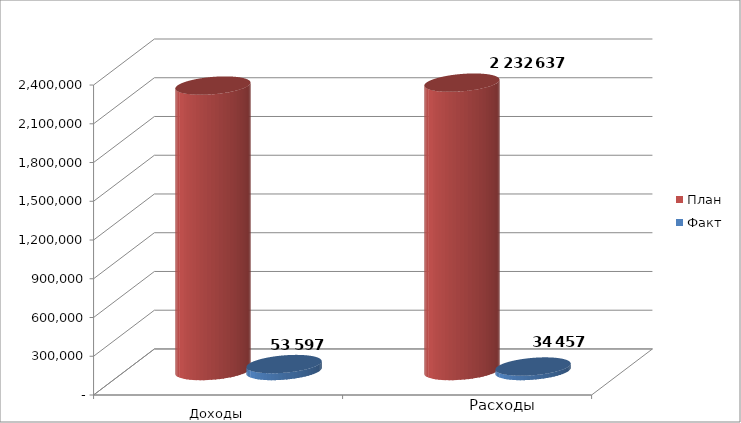
| Category | План | Факт |
|---|---|---|
| 0 | 2209936 | 53597 |
| 1 | 2232637 | 34457 |